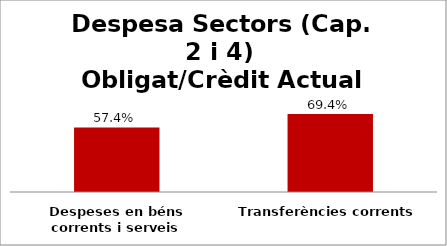
| Category | Series 0 |
|---|---|
| Despeses en béns corrents i serveis | 0.574 |
| Transferències corrents | 0.694 |